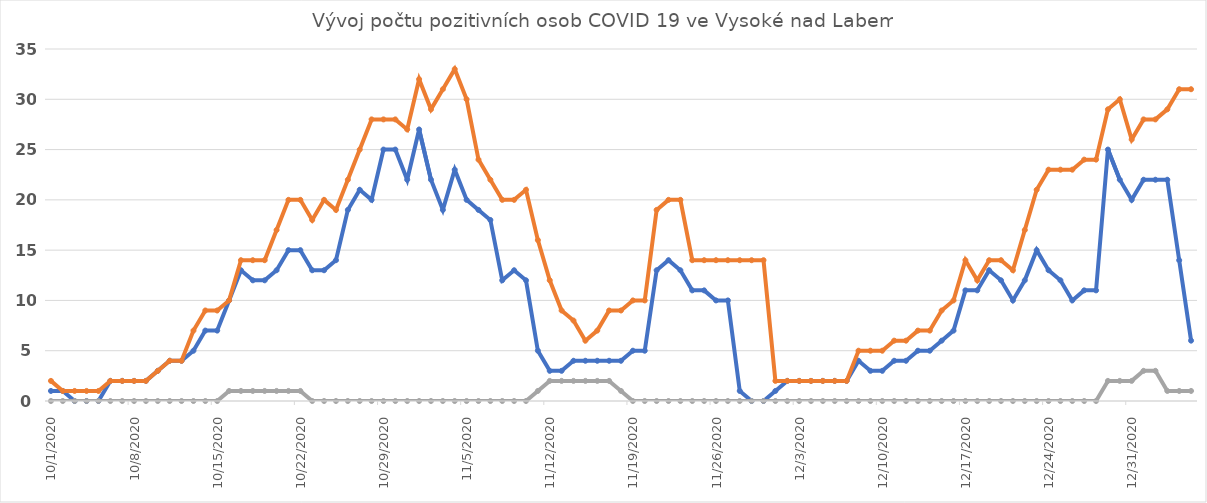
| Category | Series 0 | Series 1 | Series 2 |
|---|---|---|---|
| 10/1/20 | 1 | 2 | 0 |
| 10/2/20 | 1 | 1 | 0 |
| 10/3/20 | 0 | 1 | 0 |
| 10/4/20 | 0 | 1 | 0 |
| 10/5/20 | 0 | 1 | 0 |
| 10/6/20 | 2 | 2 | 0 |
| 10/7/20 | 2 | 2 | 0 |
| 10/8/20 | 2 | 2 | 0 |
| 10/9/20 | 2 | 2 | 0 |
| 10/10/20 | 3 | 3 | 0 |
| 10/11/20 | 4 | 4 | 0 |
| 10/12/20 | 4 | 4 | 0 |
| 10/13/20 | 5 | 7 | 0 |
| 10/14/20 | 7 | 9 | 0 |
| 10/15/20 | 7 | 9 | 0 |
| 10/16/20 | 10 | 10 | 1 |
| 10/17/20 | 13 | 14 | 1 |
| 10/18/20 | 12 | 14 | 1 |
| 10/19/20 | 12 | 14 | 1 |
| 10/20/20 | 13 | 17 | 1 |
| 10/21/20 | 15 | 20 | 1 |
| 10/22/20 | 15 | 20 | 1 |
| 10/23/20 | 13 | 18 | 0 |
| 10/24/20 | 13 | 20 | 0 |
| 10/25/20 | 14 | 19 | 0 |
| 10/26/20 | 19 | 22 | 0 |
| 10/27/20 | 21 | 25 | 0 |
| 10/28/20 | 20 | 28 | 0 |
| 10/29/20 | 25 | 28 | 0 |
| 10/30/20 | 25 | 28 | 0 |
| 10/31/20 | 22 | 27 | 0 |
| 11/1/20 | 27 | 32 | 0 |
| 11/2/20 | 22 | 29 | 0 |
| 11/3/20 | 19 | 31 | 0 |
| 11/4/20 | 23 | 33 | 0 |
| 11/5/20 | 20 | 30 | 0 |
| 11/6/20 | 19 | 24 | 0 |
| 11/7/20 | 18 | 22 | 0 |
| 11/8/20 | 12 | 20 | 0 |
| 11/9/20 | 13 | 20 | 0 |
| 11/10/20 | 12 | 21 | 0 |
| 11/11/20 | 5 | 16 | 1 |
| 11/12/20 | 3 | 12 | 2 |
| 11/13/20 | 3 | 9 | 2 |
| 11/14/20 | 4 | 8 | 2 |
| 11/15/20 | 4 | 6 | 2 |
| 11/16/20 | 4 | 7 | 2 |
| 11/17/20 | 4 | 9 | 2 |
| 11/18/20 | 4 | 9 | 1 |
| 11/19/20 | 5 | 10 | 0 |
| 11/20/20 | 5 | 10 | 0 |
| 11/21/20 | 13 | 19 | 0 |
| 11/22/20 | 14 | 20 | 0 |
| 11/23/20 | 13 | 20 | 0 |
| 11/24/20 | 11 | 14 | 0 |
| 11/25/20 | 11 | 14 | 0 |
| 11/26/20 | 10 | 14 | 0 |
| 11/27/20 | 10 | 14 | 0 |
| 11/28/20 | 1 | 14 | 0 |
| 11/29/20 | 0 | 14 | 0 |
| 11/30/20 | 0 | 14 | 0 |
| 12/1/20 | 1 | 2 | 0 |
| 12/2/20 | 2 | 2 | 0 |
| 12/3/20 | 2 | 2 | 0 |
| 12/4/20 | 2 | 2 | 0 |
| 12/5/20 | 2 | 2 | 0 |
| 12/6/20 | 2 | 2 | 0 |
| 12/7/20 | 2 | 2 | 0 |
| 12/8/20 | 4 | 5 | 0 |
| 12/9/20 | 3 | 5 | 0 |
| 12/10/20 | 3 | 5 | 0 |
| 12/11/20 | 4 | 6 | 0 |
| 12/12/20 | 4 | 6 | 0 |
| 12/13/20 | 5 | 7 | 0 |
| 12/14/20 | 5 | 7 | 0 |
| 12/15/20 | 6 | 9 | 0 |
| 12/16/20 | 7 | 10 | 0 |
| 12/17/20 | 11 | 14 | 0 |
| 12/18/20 | 11 | 12 | 0 |
| 12/19/20 | 13 | 14 | 0 |
| 12/20/20 | 12 | 14 | 0 |
| 12/21/20 | 10 | 13 | 0 |
| 12/22/20 | 12 | 17 | 0 |
| 12/23/20 | 15 | 21 | 0 |
| 12/24/20 | 13 | 23 | 0 |
| 12/25/20 | 12 | 23 | 0 |
| 12/26/20 | 10 | 23 | 0 |
| 12/27/20 | 11 | 24 | 0 |
| 12/28/20 | 11 | 24 | 0 |
| 12/29/20 | 25 | 29 | 2 |
| 12/30/20 | 22 | 30 | 2 |
| 12/31/20 | 20 | 26 | 2 |
| 1/1/21 | 22 | 28 | 3 |
| 1/2/21 | 22 | 28 | 3 |
| 1/3/21 | 22 | 29 | 1 |
| 1/4/21 | 14 | 31 | 1 |
| 1/5/21 | 6 | 31 | 1 |